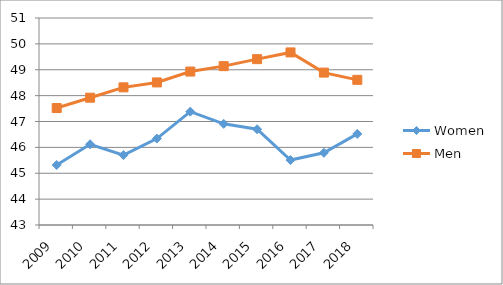
| Category | Women | Men |
|---|---|---|
| 2009.0 | 45.32 | 47.52 |
| 2010.0 | 46.12 | 47.92 |
| 2011.0 | 45.7 | 48.32 |
| 2012.0 | 46.34 | 48.51 |
| 2013.0 | 47.38 | 48.93 |
| 2014.0 | 46.91 | 49.14 |
| 2015.0 | 46.7 | 49.41 |
| 2016.0 | 45.51 | 49.67 |
| 2017.0 | 45.79 | 48.89 |
| 2018.0 | 46.52 | 48.61 |